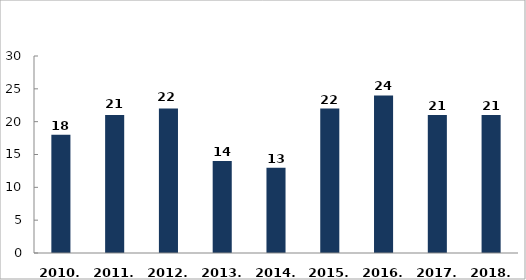
| Category | Halálos közúti közlekedési balesetek |
|---|---|
| 2010. év | 18 |
| 2011. év | 21 |
| 2012. év | 22 |
| 2013. év | 14 |
| 2014. év | 13 |
| 2015. év | 22 |
| 2016. év | 24 |
| 2017. év | 21 |
| 2018. év | 21 |